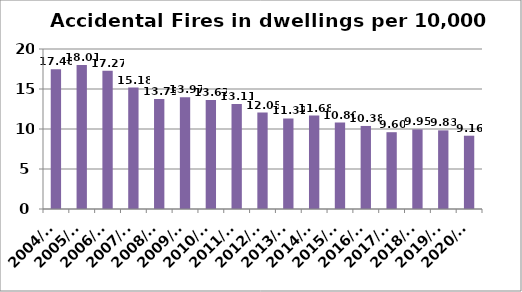
| Category | Series 0 |
|---|---|
| 2004/05 | 17.48 |
| 2005/06 | 18.01 |
| 2006/07 | 17.27 |
| 2007/08 | 15.18 |
| 2008/09 | 13.75 |
| 2009/10 | 13.97 |
| 2010/11 | 13.62 |
| 2011/12 | 13.11 |
| 2012/13 | 12.05 |
| 2013/14 | 11.32 |
| 2014/15 | 11.68 |
| 2015/16 | 10.8 |
| 2016/17 | 10.38 |
| 2017/18 | 9.6 |
| 2018/19 | 9.95 |
| 2019/20 | 9.83 |
| 2020/21 | 9.16 |